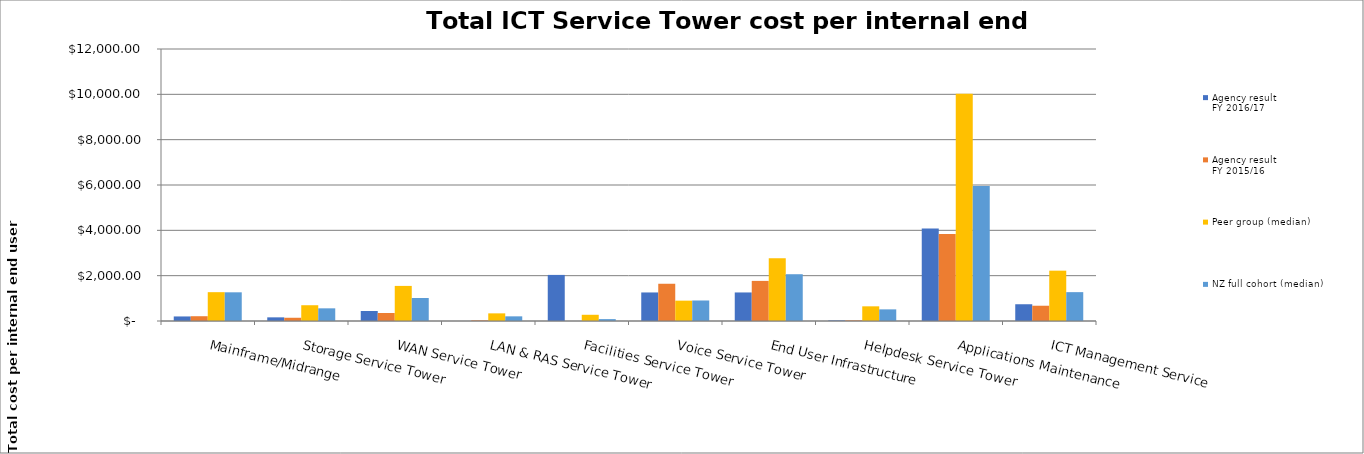
| Category | Agency result
FY 2016/17 | Agency result
FY 2015/16 | Peer group (median) | NZ full cohort (median) |
|---|---|---|---|---|
| Mainframe/Midrange | 200.888 | 211.017 | 1271.924 | 1265.608 |
| Storage Service Tower | 161.355 | 142.973 | 695.843 | 558.953 |
| WAN Service Tower | 440.097 | 352.369 | 1548.082 | 1015.902 |
| LAN & RAS Service Tower | 0 | 25.516 | 337.041 | 205.674 |
| Facilities Service Tower | 2033.481 | 0 | 274.375 | 83.092 |
| Voice Service Tower | 1259.379 | 1643.175 | 897.763 | 904.849 |
| End User Infrastructure | 1259.379 | 1769.137 | 2766.908 | 2063.692 |
| Helpdesk Service Tower | 24.203 | 25.516 | 647.292 | 513.182 |
| Applications Maintenance | 4082.291 | 3838.801 | 10026.864 | 5956.204 |
| ICT Management Service | 739.411 | 673.552 | 2220.621 | 1273.168 |